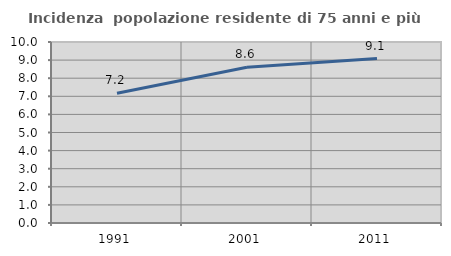
| Category | Incidenza  popolazione residente di 75 anni e più |
|---|---|
| 1991.0 | 7.164 |
| 2001.0 | 8.607 |
| 2011.0 | 9.087 |